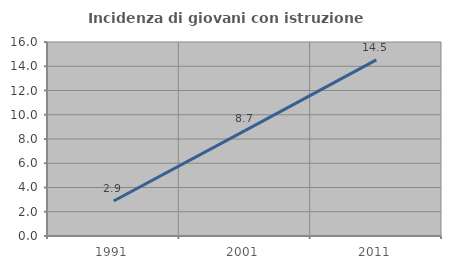
| Category | Incidenza di giovani con istruzione universitaria |
|---|---|
| 1991.0 | 2.89 |
| 2001.0 | 8.696 |
| 2011.0 | 14.53 |